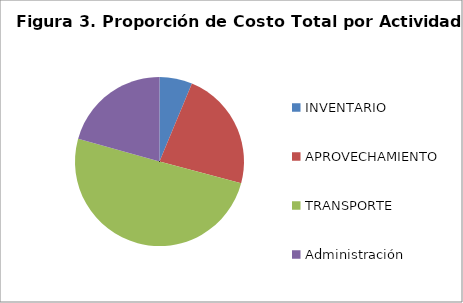
| Category | Series 0 |
|---|---|
| INVENTARIO | 587000 |
| APROVECHAMIENTO | 2142000 |
| TRANSPORTE | 4700000 |
| Administración | 1932600 |